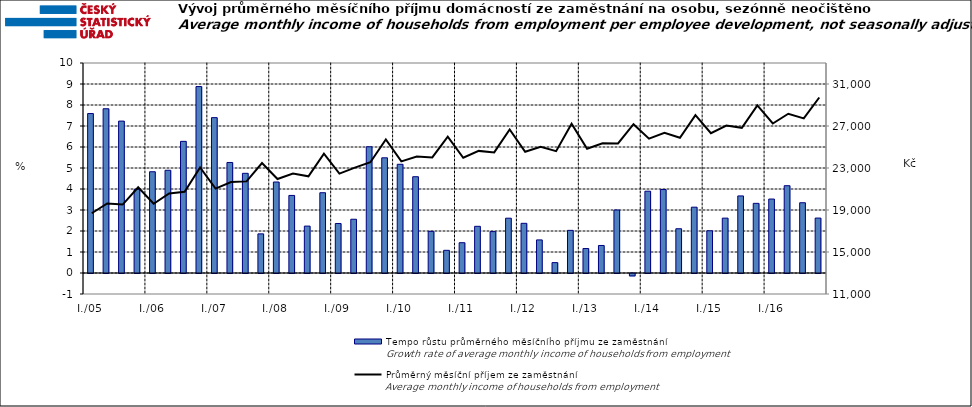
| Category | Tempo růstu průměrného měsíčního příjmu ze zaměstnání |
|---|---|
| I./05 | 7.592 |
|  | 7.822 |
|  | 7.233 |
|  | 3.981 |
| I./06 | 4.822 |
|  | 4.892 |
|  | 6.269 |
|  | 8.878 |
| I./07 | 7.399 |
|  | 5.263 |
|  | 4.746 |
|  | 1.864 |
| I./08 | 4.333 |
|  | 3.694 |
|  | 2.233 |
|  | 3.823 |
| I./09 | 2.357 |
|  | 2.56 |
|  | 6.011 |
|  | 5.485 |
| I./10 | 5.177 |
|  | 4.584 |
|  | 1.983 |
|  | 1.08 |
| I./11 | 1.442 |
|  | 2.223 |
|  | 1.972 |
|  | 2.61 |
| I./12 | 2.366 |
|  | 1.576 |
|  | 0.494 |
|  | 2.03 |
| I./13 | 1.165 |
|  | 1.311 |
|  | 3 |
|  | -0.114 |
| I./14 | 3.894 |
|  | 3.974 |
|  | 2.107 |
|  | 3.135 |
| I./15 | 2.011 |
|  | 2.613 |
|  | 3.67 |
|  | 3.317 |
| I./16 | 3.522 |